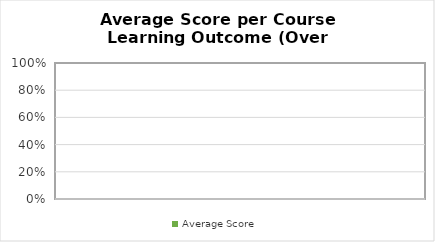
| Category | Average Score |
|---|---|
| 0 | 0 |
| 1 | 0 |
| 2 | 0 |
| 3 | 0 |
| 4 | 0 |
| 5 | 0 |
| 6 | 0 |
| 7 | 0 |
| 8 | 0 |
| 9 | 0 |
| 10 | 0 |